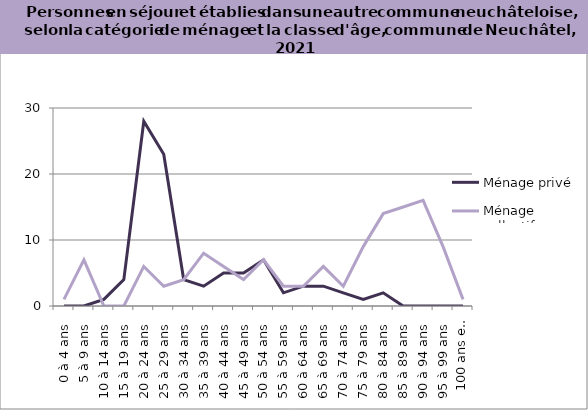
| Category | Ménage privé | Ménage collectif |
|---|---|---|
| 0 à 4 ans | 0 | 1 |
| 5 à 9 ans | 0 | 7 |
| 10 à 14 ans | 1 | 0 |
| 15 à 19 ans | 4 | 0 |
| 20 à 24 ans | 28 | 6 |
| 25 à 29 ans | 23 | 3 |
| 30 à 34 ans | 4 | 4 |
| 35 à 39 ans | 3 | 8 |
| 40 à 44 ans | 5 | 6 |
| 45 à 49 ans | 5 | 4 |
| 50 à 54 ans | 7 | 7 |
| 55 à 59 ans | 2 | 3 |
| 60 à 64 ans | 3 | 3 |
| 65 à 69 ans | 3 | 6 |
| 70 à 74 ans | 2 | 3 |
| 75 à 79 ans | 1 | 9 |
| 80 à 84 ans | 2 | 14 |
| 85 à 89 ans | 0 | 15 |
| 90 à 94 ans | 0 | 16 |
| 95 à 99 ans | 0 | 9 |
| 100 ans et plus | 0 | 1 |